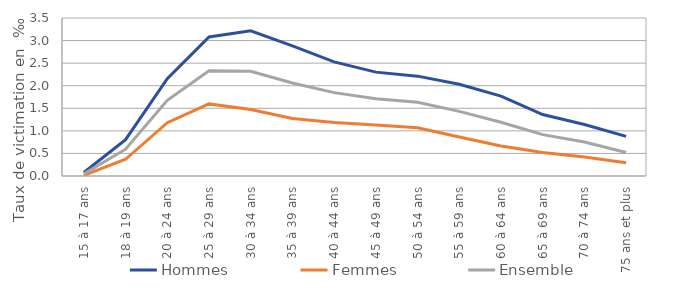
| Category | Hommes | Femmes | Ensemble |
|---|---|---|---|
| 15 à 17 ans | 0.076 | 0.016 | 0.047 |
| 18 à 19 ans | 0.805 | 0.371 | 0.594 |
| 20 à 24 ans | 2.155 | 1.181 | 1.675 |
| 25 à 29 ans | 3.079 | 1.597 | 2.331 |
| 30 à 34 ans | 3.215 | 1.474 | 2.321 |
| 35 à 39 ans | 2.881 | 1.274 | 2.059 |
| 40 à 44 ans | 2.527 | 1.185 | 1.847 |
| 45 à 49 ans | 2.301 | 1.131 | 1.711 |
| 50 à 54 ans | 2.212 | 1.07 | 1.632 |
| 55 à 59 ans | 2.032 | 0.864 | 1.432 |
| 60 à 64 ans | 1.768 | 0.664 | 1.19 |
| 65 à 69 ans | 1.361 | 0.52 | 0.916 |
| 70 à 74 ans | 1.14 | 0.421 | 0.754 |
| 75 ans et plus | 0.877 | 0.293 | 0.52 |